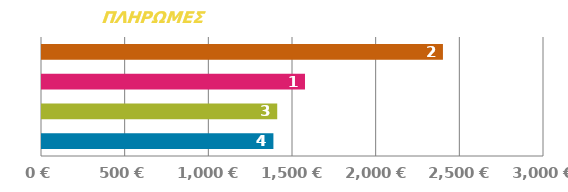
| Category | ΠΛΗΡΩΜΗ |
|---|---|
| 0 | 1382.921 |
| 1 | 1405.775 |
| 2 | 1571.655 |
| 3 | 2396.046 |